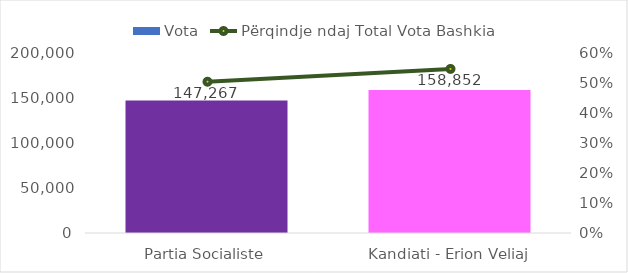
| Category | Vota |
|---|---|
| Partia Socialiste | 147267 |
| Kandiati - Erion Veliaj | 158852 |